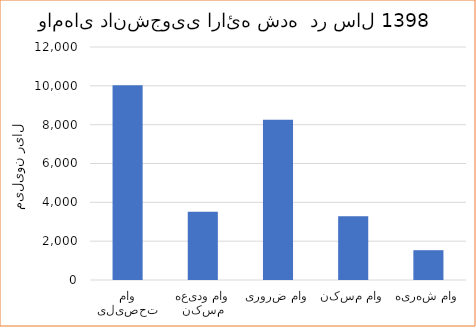
| Category | مبلغ (میلیون ریال) |
|---|---|
| وام تحصیلی | 10026.5 |
| وام ودیعه مسکن | 3510 |
| وام ضروری | 8248.9 |
| وام مسکن | 3278 |
| وام شهریه | 1535 |